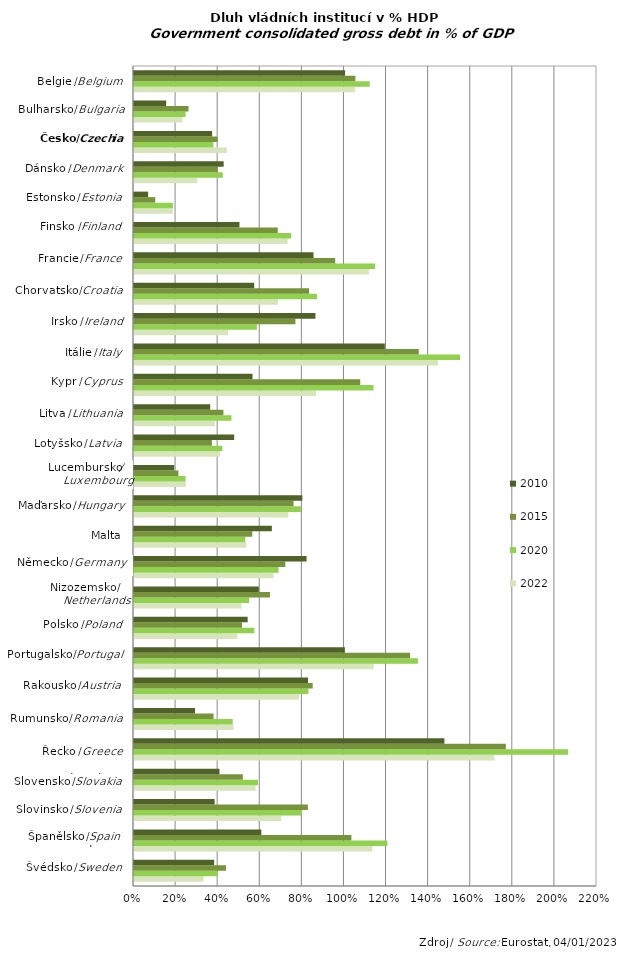
| Category | 2022 | 2020 | 2015 | 2010 |
|---|---|---|---|---|
| Sweden | 0.33 | 0.398 | 0.437 | 0.381 |
| Spain | 1.132 | 1.204 | 1.033 | 0.605 |
| Slovenia | 0.699 | 0.796 | 0.826 | 0.383 |
| Slovakia | 0.578 | 0.589 | 0.517 | 0.406 |
| Greece | 1.713 | 2.063 | 1.767 | 1.475 |
| Romania | 0.473 | 0.469 | 0.378 | 0.29 |
| Austria | 0.784 | 0.829 | 0.849 | 0.827 |
| Portugal | 1.139 | 1.349 | 1.312 | 1.002 |
| Poland | 0.491 | 0.572 | 0.513 | 0.54 |
| Netherlands | 0.51 | 0.547 | 0.646 | 0.593 |
| Germany | 0.663 | 0.687 | 0.719 | 0.82 |
| Malta | 0.534 | 0.529 | 0.562 | 0.655 |
| Hungary | 0.733 | 0.793 | 0.758 | 0.8 |
| Luxembourg | 0.246 | 0.245 | 0.211 | 0.191 |
| Latvia | 0.408 | 0.42 | 0.37 | 0.476 |
| Lithuania | 0.384 | 0.463 | 0.425 | 0.362 |
| Cyprus | 0.865 | 1.138 | 1.075 | 0.563 |
| Italy | 1.444 | 1.549 | 1.353 | 1.192 |
| Ireland | 0.447 | 0.584 | 0.767 | 0.862 |
| Croatia | 0.684 | 0.87 | 0.832 | 0.571 |
| France | 1.116 | 1.146 | 0.956 | 0.853 |
| Finland | 0.73 | 0.747 | 0.683 | 0.501 |
| Estonia | 0.184 | 0.185 | 0.101 | 0.067 |
| Denmark | 0.301 | 0.422 | 0.398 | 0.426 |
| Czechia | 0.441 | 0.377 | 0.397 | 0.371 |
| Bulgaria | 0.229 | 0.245 | 0.259 | 0.153 |
| Belgium | 1.051 | 1.12 | 1.052 | 1.003 |